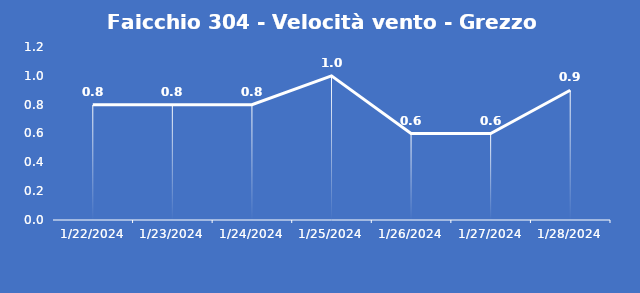
| Category | Faicchio 304 - Velocità vento - Grezzo (m/s) |
|---|---|
| 1/22/24 | 0.8 |
| 1/23/24 | 0.8 |
| 1/24/24 | 0.8 |
| 1/25/24 | 1 |
| 1/26/24 | 0.6 |
| 1/27/24 | 0.6 |
| 1/28/24 | 0.9 |